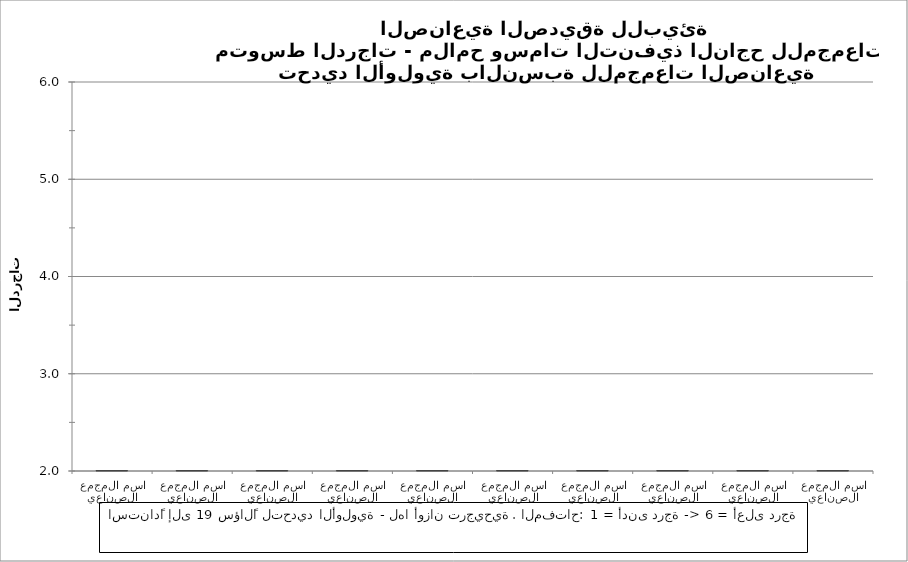
| Category | Series 0 |
|---|---|
| اسم المجمع الصناعي | 0 |
| اسم المجمع الصناعي | 0 |
| اسم المجمع الصناعي | 0 |
| اسم المجمع الصناعي | 0 |
| اسم المجمع الصناعي | 0 |
| اسم المجمع الصناعي | 0 |
| اسم المجمع الصناعي | 0 |
| اسم المجمع الصناعي | 0 |
| اسم المجمع الصناعي | 0 |
| اسم المجمع الصناعي | 0 |